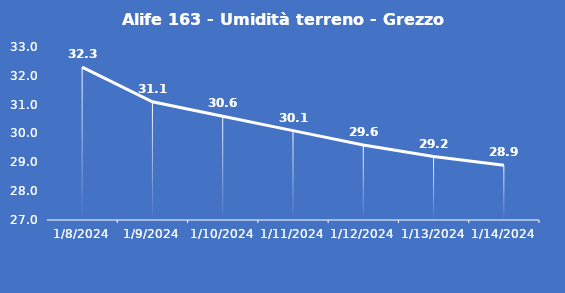
| Category | Alife 163 - Umidità terreno - Grezzo (%VWC) |
|---|---|
| 1/8/24 | 32.3 |
| 1/9/24 | 31.1 |
| 1/10/24 | 30.6 |
| 1/11/24 | 30.1 |
| 1/12/24 | 29.6 |
| 1/13/24 | 29.2 |
| 1/14/24 | 28.9 |